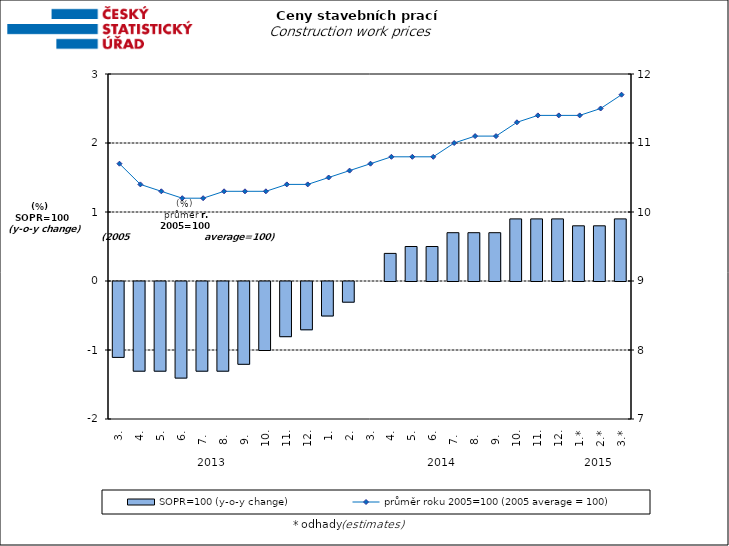
| Category | SOPR=100 (y-o-y change)   |
|---|---|
| 0 | -1.1 |
| 1 | -1.3 |
| 2 | -1.3 |
| 3 | -1.4 |
| 4 | -1.3 |
| 5 | -1.3 |
| 6 | -1.2 |
| 7 | -1 |
| 8 | -0.8 |
| 9 | -0.7 |
| 10 | -0.5 |
| 11 | -0.3 |
| 12 | 0 |
| 13 | 0.4 |
| 14 | 0.5 |
| 15 | 0.5 |
| 16 | 0.7 |
| 17 | 0.7 |
| 18 | 0.7 |
| 19 | 0.9 |
| 20 | 0.9 |
| 21 | 0.9 |
| 22 | 0.8 |
| 23 | 0.8 |
| 24 | 0.9 |